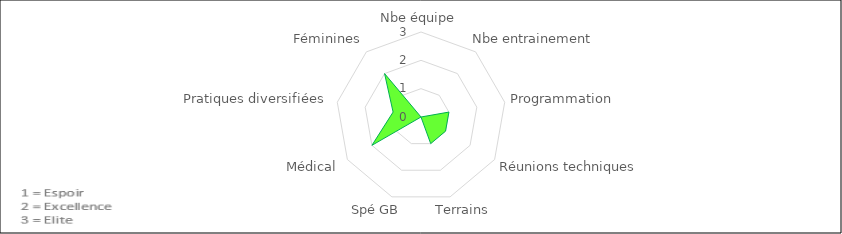
| Category | Series 0 |
|---|---|
| Nbe équipe | 0 |
| Nbe entrainement | 0 |
| Programmation | 1 |
| Réunions techniques | 1 |
| Terrains | 1 |
| Spé GB | 0 |
| Médical | 2 |
| Pratiques diversifiées | 1 |
| Féminines | 2 |